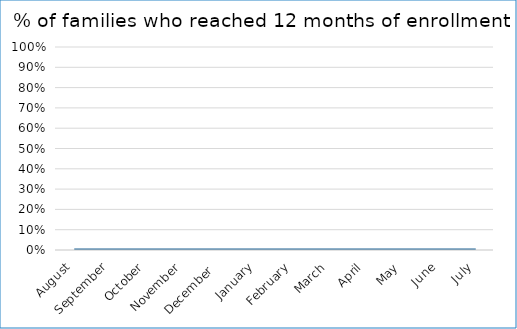
| Category | % of families who reached 12 months of enrollment |
|---|---|
| August | 0 |
| September | 0 |
| October | 0 |
| November | 0 |
| December  | 0 |
| January | 0 |
| February | 0 |
| March | 0 |
| April | 0 |
| May | 0 |
| June | 0 |
| July | 0 |